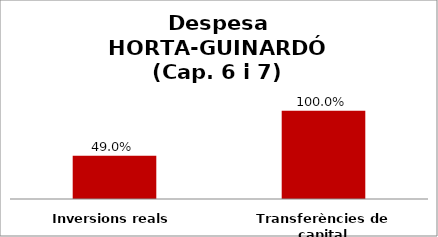
| Category | Series 0 |
|---|---|
| Inversions reals | 0.49 |
| Transferències de capital | 1 |